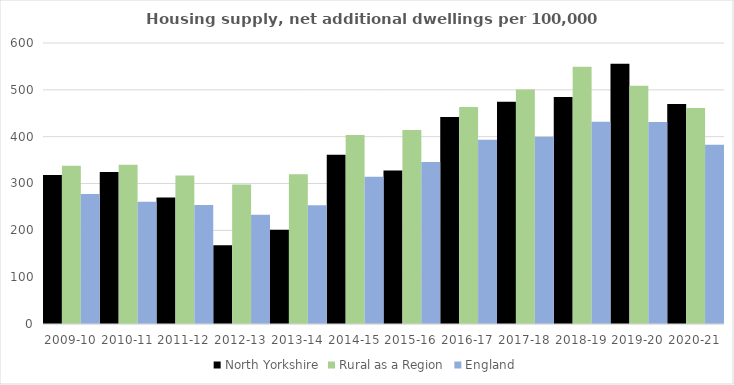
| Category | North Yorkshire | Rural as a Region | England |
|---|---|---|---|
| 2009-10 | 318.027 | 337.852 | 277.548 |
| 2010-11 | 324.476 | 340.105 | 260.994 |
| 2011-12 | 270.124 | 317.04 | 254.007 |
| 2012-13 | 168.349 | 297.763 | 233.153 |
| 2013-14 | 201.249 | 319.835 | 253.602 |
| 2014-15 | 361.649 | 403.796 | 314.256 |
| 2015-16 | 327.549 | 414.091 | 346.154 |
| 2016-17 | 441.81 | 463.209 | 393.256 |
| 2017-18 | 474.304 | 500.68 | 399.646 |
| 2018-19 | 484.78 | 549.491 | 432.099 |
| 2019-20 | 555.615 | 508.493 | 431.187 |
| 2020-21 | 469.538 | 461.114 | 382.827 |